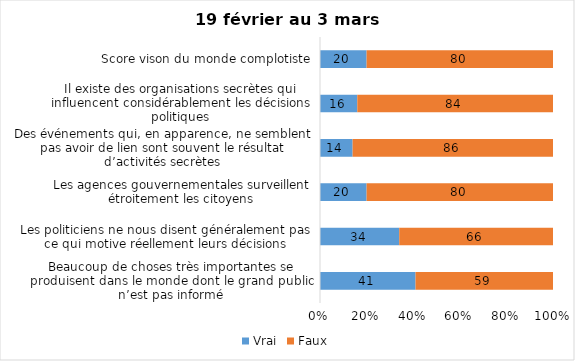
| Category | Vrai | Faux |
|---|---|---|
| Beaucoup de choses très importantes se produisent dans le monde dont le grand public n’est pas informé | 41 | 59 |
| Les politiciens ne nous disent généralement pas ce qui motive réellement leurs décisions | 34 | 66 |
| Les agences gouvernementales surveillent étroitement les citoyens | 20 | 80 |
| Des événements qui, en apparence, ne semblent pas avoir de lien sont souvent le résultat d’activités secrètes | 14 | 86 |
| Il existe des organisations secrètes qui influencent considérablement les décisions politiques | 16 | 84 |
| Score vison du monde complotiste | 20 | 80 |